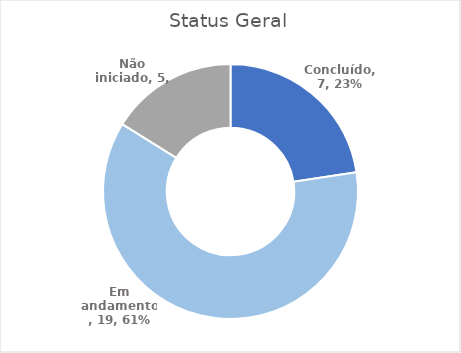
| Category | Status Geral |
|---|---|
| Concluído | 7 |
| Em andamento | 19 |
| Não iniciado | 5 |
| Suspenso | 0 |